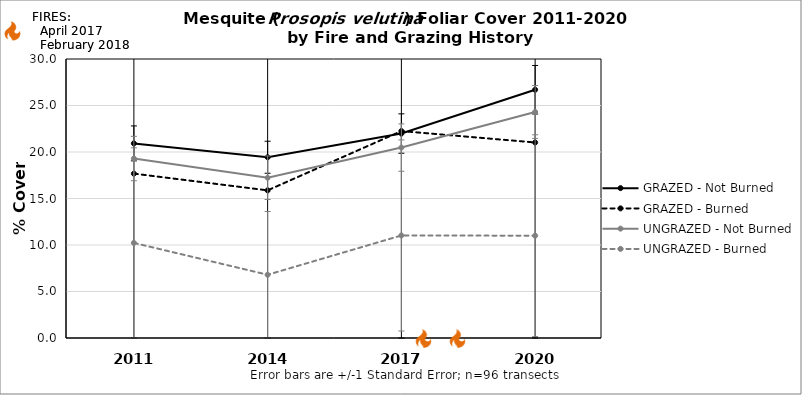
| Category | GRAZED - Not Burned | GRAZED - Burned | UNGRAZED - Not Burned | UNGRAZED - Burned |
|---|---|---|---|---|
| 2011.0 | 20.926 | 17.675 | 19.298 | 10.225 |
| 2014.0 | 19.436 | 15.875 | 17.232 | 6.8 |
| 2017.0 | 21.985 | 22.25 | 20.476 | 11.025 |
| 2020.0 | 26.694 | 21.025 | 24.304 | 11 |